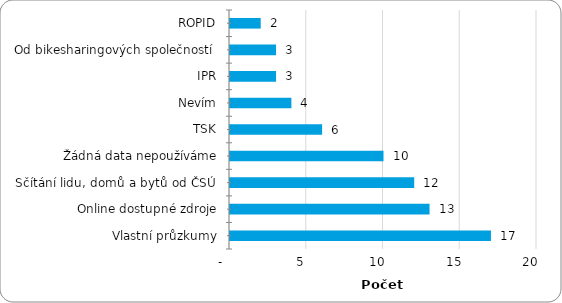
| Category | Series 0 |
|---|---|
|  ROPID | 2 |
|  Od bikesharingových společností  | 3 |
|  IPR | 3 |
|  Nevím | 4 |
|  TSK | 6 |
|  Žádná data nepoužíváme | 10 |
|  Sčítání lidu, domů a bytů od ČSÚ  | 12 |
|  Online dostupné zdroje | 13 |
|  Vlastní průzkumy | 17 |